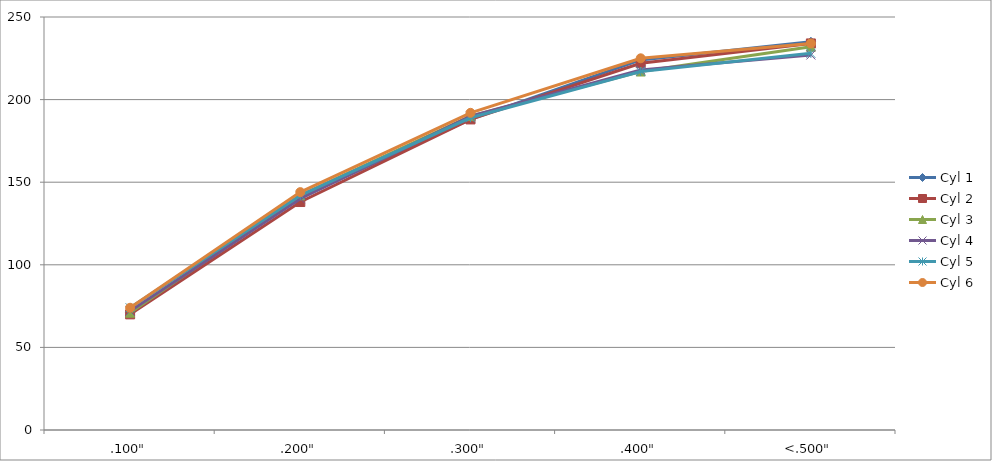
| Category | Cyl 1 | Cyl 2 | Cyl 3 | Cyl 4 | Cyl 5 | Cyl 6 |
|---|---|---|---|---|---|---|
| .100" | 71 | 70 | 71 | 72 | 74 | 74 |
| .200" | 141 | 138 | 142 | 140 | 142 | 144 |
| .300" | 188 | 188 | 190 | 190 | 189 | 192 |
| .400" | 224 | 222 | 217 | 218 | 217 | 225 |
| <.500" | 235 | 234 | 232 | 227 | 228 | 234 |